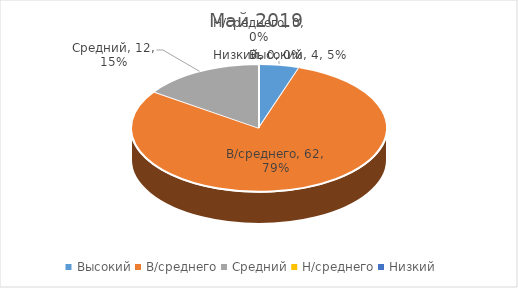
| Category | Май 2019 |
|---|---|
| Высокий | 4 |
| В/среднего | 62 |
| Средний | 12 |
| Н/среднего | 0 |
| Низкий | 0 |